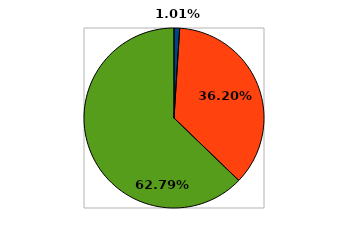
| Category | Series 0 |
|---|---|
| 0 | 0.01 |
| 1 | 0.362 |
| 2 | 0.628 |